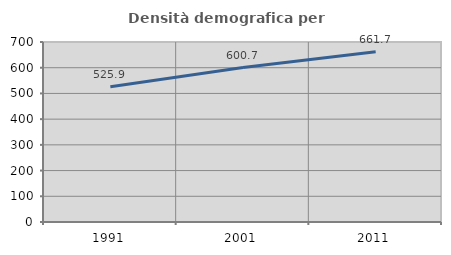
| Category | Densità demografica |
|---|---|
| 1991.0 | 525.92 |
| 2001.0 | 600.675 |
| 2011.0 | 661.718 |